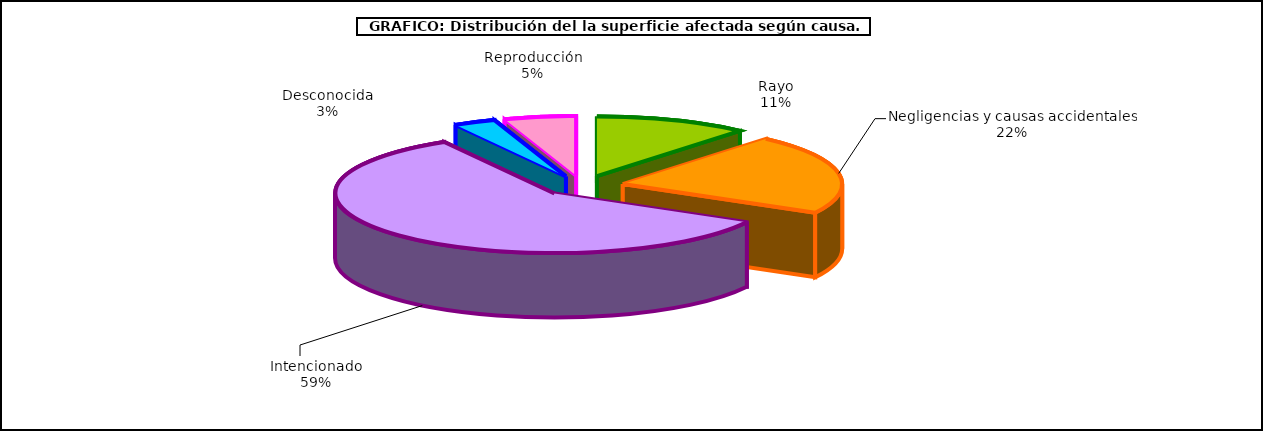
| Category | Series 0 |
|---|---|
| Rayo | 12400.39 |
| Negligencias y causas accidentales | 23809.91 |
| Intencionado | 64371.84 |
| Desconocida | 3403.84 |
| Reproducción | 5796.87 |